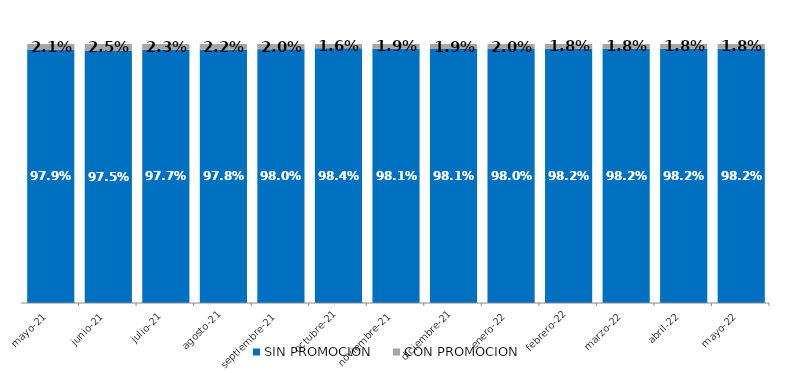
| Category | SIN PROMOCION   | CON PROMOCION   |
|---|---|---|
| 2021-05-01 | 0.979 | 0.021 |
| 2021-06-01 | 0.975 | 0.025 |
| 2021-07-01 | 0.977 | 0.023 |
| 2021-08-01 | 0.978 | 0.022 |
| 2021-09-01 | 0.98 | 0.02 |
| 2021-10-01 | 0.984 | 0.016 |
| 2021-11-01 | 0.981 | 0.019 |
| 2021-12-01 | 0.981 | 0.019 |
| 2022-01-01 | 0.98 | 0.02 |
| 2022-02-01 | 0.982 | 0.018 |
| 2022-03-01 | 0.982 | 0.018 |
| 2022-04-01 | 0.982 | 0.018 |
| 2022-05-01 | 0.982 | 0.018 |